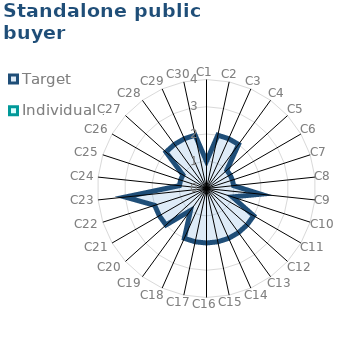
| Category | Target | Individual 1 |
|---|---|---|
| C1 | 1 | 0 |
| C2 | 2 | 0 |
| C3 | 2 | 0 |
| C4 | 2 | 0 |
| C5 | 1 | 0 |
| C6 | 1 | 0 |
| C7 | 1 | 0 |
| C8 | 1 | 0 |
| C9 | 2 | 0 |
| C10 | 1 | 0 |
| C11 | 2 | 0 |
| C12 | 2 | 0 |
| C13 | 2 | 0 |
| C14 | 2 | 0 |
| C15 | 2 | 0 |
| C16 | 2 | 0 |
| C17 | 2 | 0 |
| C18 | 2 | 0 |
| C19 | 1 | 0 |
| C20 | 2 | 0 |
| C21 | 2 | 0 |
| C22 | 2 | 0 |
| C23 | 3 | 0 |
| C24 | 1 | 0 |
| C25 | 1 | 0 |
| C26 | 1 | 0 |
| C27 | 2 | 0 |
| C28 | 2 | 0 |
| C29 | 2 | 0 |
| C30 | 2 | 0 |